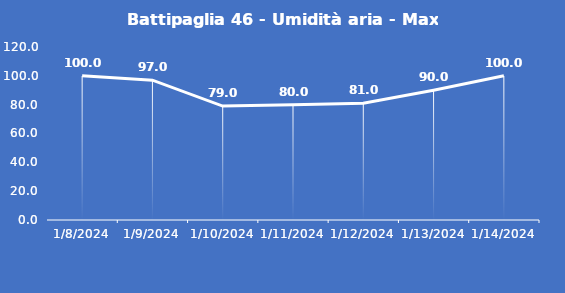
| Category | Battipaglia 46 - Umidità aria - Max (%) |
|---|---|
| 1/8/24 | 100 |
| 1/9/24 | 97 |
| 1/10/24 | 79 |
| 1/11/24 | 80 |
| 1/12/24 | 81 |
| 1/13/24 | 90 |
| 1/14/24 | 100 |